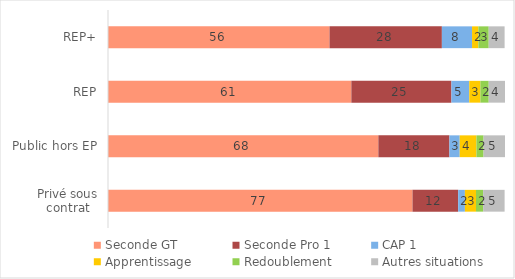
| Category | Seconde GT | Seconde Pro 1 | CAP 1 | Apprentissage | Redoublement | Autres situations |
|---|---|---|---|---|---|---|
| REP+ | 55.8 | 28.3 | 7.6 | 1.6 | 2.6 | 4 |
| REP | 61.3 | 25.2 | 4.5 | 2.8 | 2.1 | 4.1 |
| Public hors EP | 68.1 | 17.9 | 2.6 | 4.2 | 1.8 | 5.4 |
| Privé sous contrat | 76.7 | 11.5 | 1.7 | 2.8 | 1.8 | 5.4 |